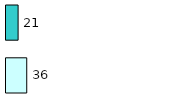
| Category | Series 0 | Series 1 |
|---|---|---|
| 0 | 36 | 21 |